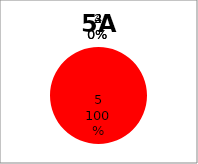
| Category | Series 0 |
|---|---|
| 5.0 | 10 |
| 4.0 | 0 |
| 3.0 | 0 |
| 2.0 | 0 |